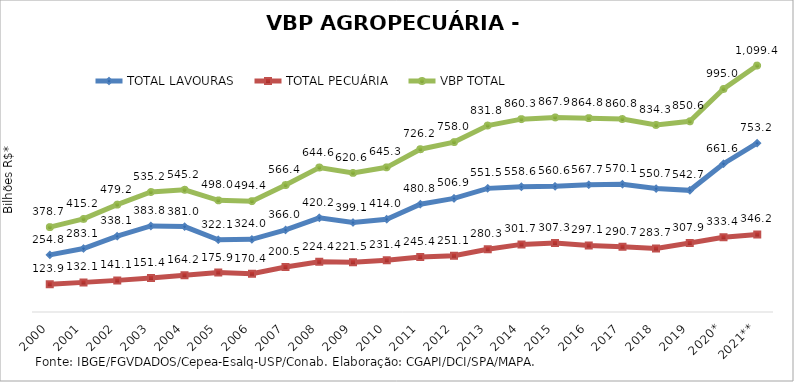
| Category | TOTAL LAVOURAS | TOTAL PECUÁRIA | VBP TOTAL |
|---|---|---|---|
| 2000 | 254.82 | 123.865 | 378.685 |
| 2001 | 283.057 | 132.148 | 415.206 |
| 2002 | 338.122 | 141.069 | 479.191 |
| 2003 | 383.766 | 151.413 | 535.179 |
| 2004 | 380.956 | 164.24 | 545.196 |
| 2005 | 322.081 | 175.941 | 498.022 |
| 2006 | 324.049 | 170.401 | 494.45 |
| 2007 | 365.954 | 200.467 | 566.421 |
| 2008 | 420.205 | 224.371 | 644.576 |
| 2009 | 399.14 | 221.453 | 620.592 |
| 2010 | 413.952 | 231.375 | 645.327 |
| 2011 | 480.754 | 245.43 | 726.184 |
| 2012 | 506.897 | 251.06 | 757.957 |
| 2013 | 551.507 | 280.278 | 831.785 |
| 2014 | 558.602 | 301.659 | 860.261 |
| 2015 | 560.629 | 307.308 | 867.937 |
| 2016 | 567.719 | 297.09 | 864.809 |
| 2017 | 570.076 | 290.706 | 860.782 |
| 2018 | 550.661 | 283.676 | 834.337 |
| 2019 | 542.742 | 307.87 | 850.612 |
| 2020* | 661.616 | 333.423 | 995.038 |
| 2021** | 753.195 | 346.184 | 1099.379 |